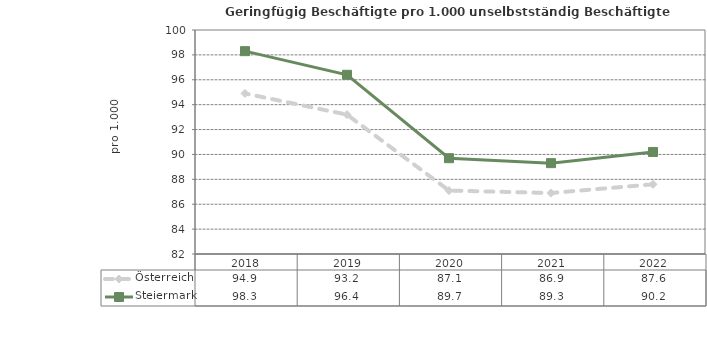
| Category | Österreich | Steiermark |
|---|---|---|
| 2022.0 | 87.6 | 90.2 |
| 2021.0 | 86.9 | 89.3 |
| 2020.0 | 87.1 | 89.7 |
| 2019.0 | 93.2 | 96.4 |
| 2018.0 | 94.9 | 98.3 |